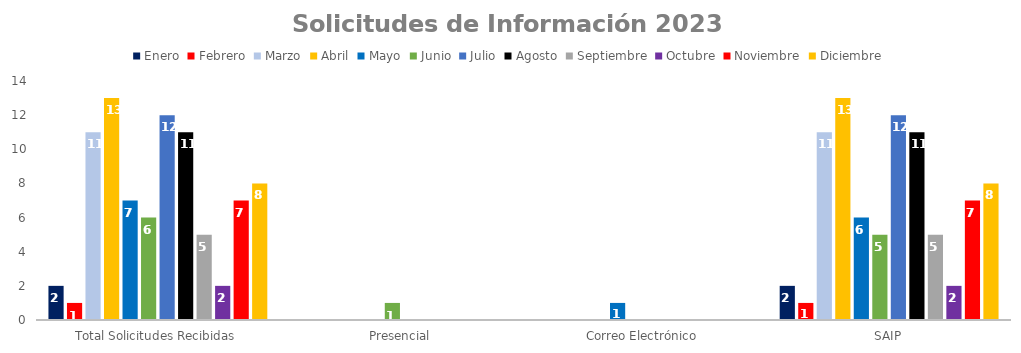
| Category | Enero | Febrero | Marzo | Abril | Mayo | Junio | Julio | Agosto | Septiembre | Octubre | Noviembre | Diciembre |
|---|---|---|---|---|---|---|---|---|---|---|---|---|
| Total Solicitudes Recibidas | 2 | 1 | 11 | 13 | 7 | 6 | 12 | 11 | 5 | 2 | 7 | 8 |
| Presencial | 0 | 0 | 0 | 0 | 0 | 1 | 0 | 0 | 0 | 0 | 0 | 0 |
| Correo Electrónico  | 0 | 0 | 0 | 0 | 1 | 0 | 0 | 0 | 0 | 0 | 0 | 0 |
| SAIP | 2 | 1 | 11 | 13 | 6 | 5 | 12 | 11 | 5 | 2 | 7 | 8 |